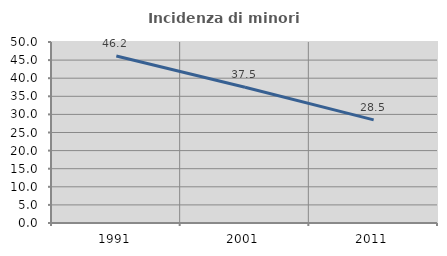
| Category | Incidenza di minori stranieri |
|---|---|
| 1991.0 | 46.154 |
| 2001.0 | 37.5 |
| 2011.0 | 28.492 |